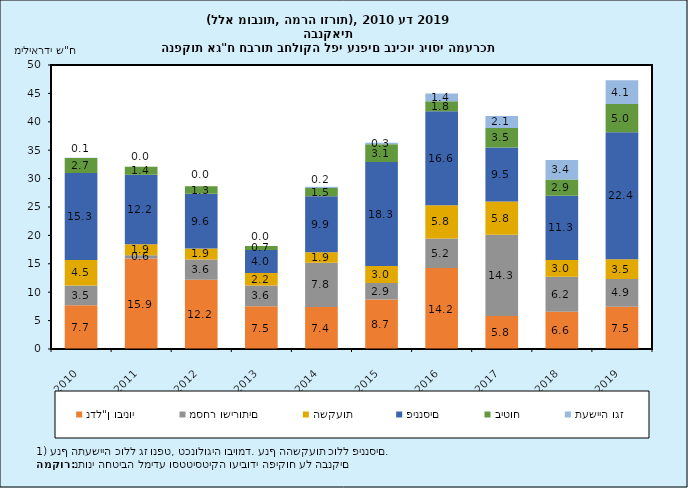
| Category | נדל"ן ובינוי | מסחר ושירותים | השקעות | פיננסים | ביטוח | תעשייה וגז |
|---|---|---|---|---|---|---|
| 2010-12-31 | 7.711 | 3.456 | 4.518 | 15.28 | 2.661 | 0.061 |
| 2011-12-31 | 15.934 | 0.564 | 1.945 | 12.239 | 1.405 | 0 |
| 2012-12-31 | 12.196 | 3.573 | 1.926 | 9.625 | 1.32 | 0 |
| 2013-12-31 | 7.543 | 3.632 | 2.207 | 4.041 | 0.718 | 0 |
| 2014-12-31 | 7.377 | 7.792 | 1.862 | 9.86 | 1.477 | 0.213 |
| 2015-12-31 | 8.723 | 2.905 | 2.975 | 18.316 | 3.114 | 0.281 |
| 2016-12-31 | 14.25 | 5.205 | 5.839 | 16.559 | 1.776 | 1.37 |
| 2017-12-31 | 5.826 | 14.287 | 5.839 | 9.51 | 3.457 | 2.119 |
| 2018-12-31 | 6.564 | 6.161 | 2.957 | 11.286 | 2.86 | 3.433 |
| 2019-12-31 | 7.459 | 4.854 | 3.491 | 22.356 | 4.99 | 4.149 |